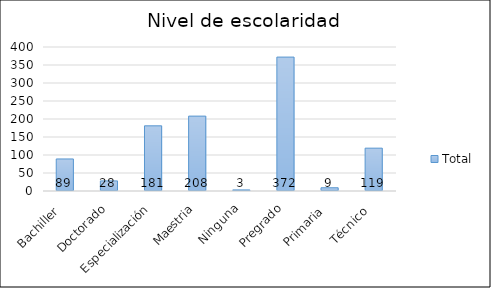
| Category | Total |
|---|---|
| Bachiller  | 89 |
| Doctorado | 28 |
| Especialización | 181 |
| Maestria | 208 |
| Ninguna | 3 |
| Pregrado | 372 |
| Primaria  | 9 |
| Técnico  | 119 |